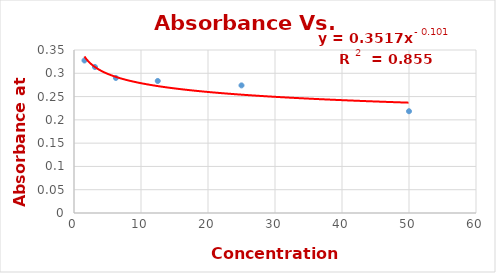
| Category | Series 0 |
|---|---|
| 50.0 | 0.218 |
| 25.0 | 0.274 |
| 12.5 | 0.284 |
| 6.25 | 0.29 |
| 3.125 | 0.314 |
| 1.5625 | 0.328 |